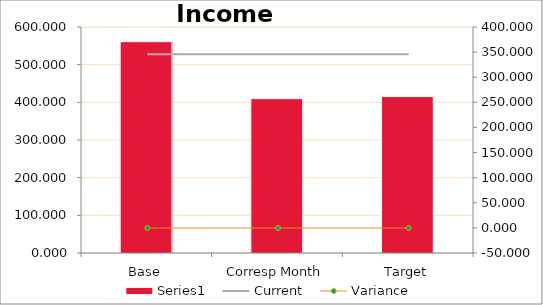
| Category | Series 0 |
|---|---|
| Base | 560.924 |
| Corresp Month | 409.789 |
| Target | 415.293 |